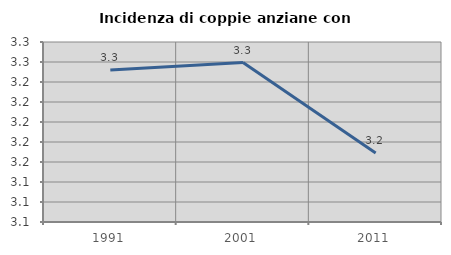
| Category | Incidenza di coppie anziane con figli |
|---|---|
| 1991.0 | 3.252 |
| 2001.0 | 3.259 |
| 2011.0 | 3.169 |